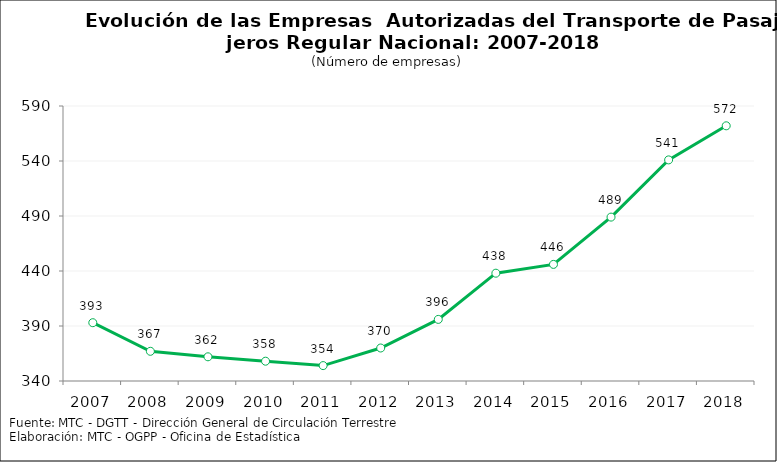
| Category | Series 0 |
|---|---|
| 2007.0 | 393 |
| 2008.0 | 367 |
| 2009.0 | 362 |
| 2010.0 | 358 |
| 2011.0 | 354 |
| 2012.0 | 370 |
| 2013.0 | 396 |
| 2014.0 | 438 |
| 2015.0 | 446 |
| 2016.0 | 489 |
| 2017.0 | 541 |
| 2018.0 | 572 |